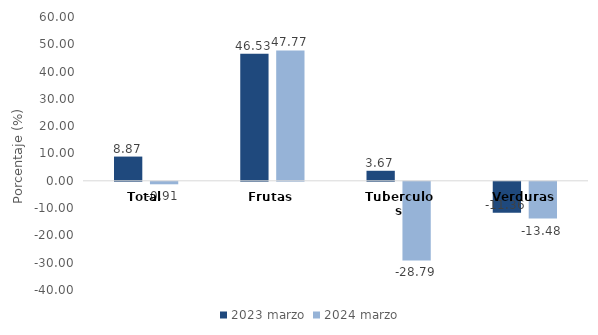
| Category | 2023 | 2024 |
|---|---|---|
| Total | 8.872 | -0.913 |
| Frutas | 46.528 | 47.768 |
| Tuberculos | 3.671 | -28.793 |
| Verduras | -11.362 | -13.485 |